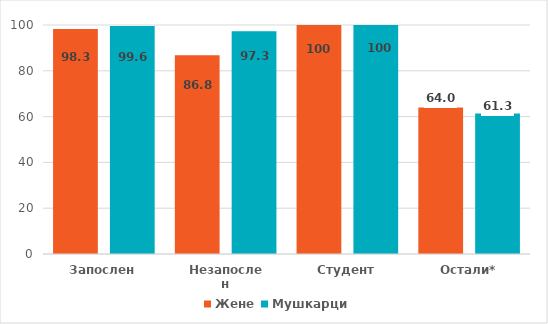
| Category | Жене | Мушкарци |
|---|---|---|
| Запослен | 98.3 | 99.6 |
| Незапослен | 86.8 | 97.3 |
| Студент | 100 | 100 |
| Остали* | 64 | 61.3 |